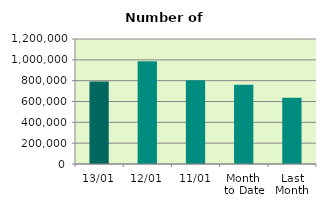
| Category | Series 0 |
|---|---|
| 13/01 | 791380 |
| 12/01 | 986046 |
| 11/01 | 805122 |
| Month 
to Date | 760816.667 |
| Last
Month | 635205.478 |